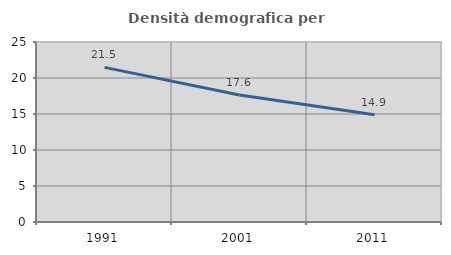
| Category | Densità demografica |
|---|---|
| 1991.0 | 21.479 |
| 2001.0 | 17.643 |
| 2011.0 | 14.908 |